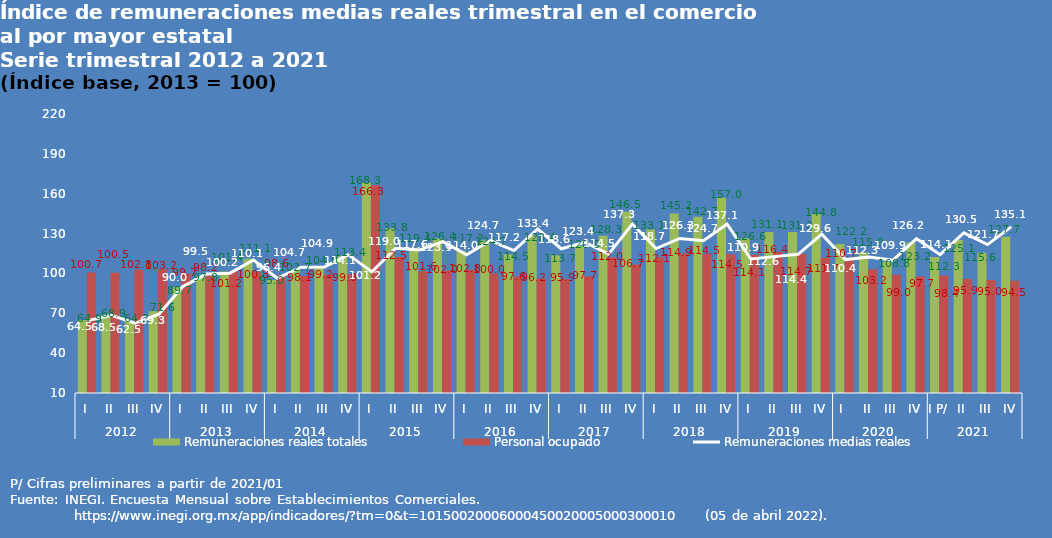
| Category | Remuneraciones reales totales | Personal ocupado |
|---|---|---|
| 0 | 64.921 | 100.723 |
| 1 | 68.91 | 100.549 |
| 2 | 64.217 | 102.781 |
| 3 | 71.569 | 103.211 |
| 4 | 89.721 | 99.686 |
| 5 | 97.77 | 98.233 |
| 6 | 101.438 | 101.236 |
| 7 | 111.072 | 100.844 |
| 8 | 95.039 | 98.639 |
| 9 | 102.676 | 98.084 |
| 10 | 104.036 | 99.186 |
| 11 | 113.379 | 99.33 |
| 12 | 168.251 | 166.301 |
| 13 | 133.781 | 112.452 |
| 14 | 119.396 | 101.554 |
| 15 | 126.372 | 101.96 |
| 16 | 117.236 | 102.836 |
| 17 | 124.721 | 99.993 |
| 18 | 114.454 | 97.621 |
| 19 | 128.351 | 96.191 |
| 20 | 113.72 | 95.897 |
| 21 | 120.562 | 97.679 |
| 22 | 128.271 | 111.99 |
| 23 | 146.511 | 106.735 |
| 24 | 133.075 | 112.092 |
| 25 | 145.152 | 114.912 |
| 26 | 142.705 | 114.48 |
| 27 | 157.021 | 114.507 |
| 28 | 126.57 | 114.143 |
| 29 | 131.117 | 116.396 |
| 30 | 131.176 | 114.659 |
| 31 | 144.805 | 111.738 |
| 32 | 122.19 | 110.678 |
| 33 | 115.886 | 103.163 |
| 34 | 108.831 | 99.023 |
| 35 | 123.236 | 97.669 |
| 36 | 112.3 | 98.4 |
| 37 | 125.133 | 95.877 |
| 38 | 115.62 | 94.992 |
| 39 | 127.672 | 94.534 |